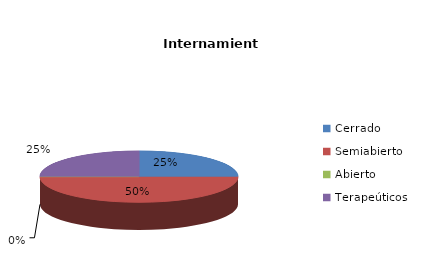
| Category | Series 0 |
|---|---|
| Cerrado | 1 |
| Semiabierto | 2 |
| Abierto | 0 |
| Terapeúticos | 1 |